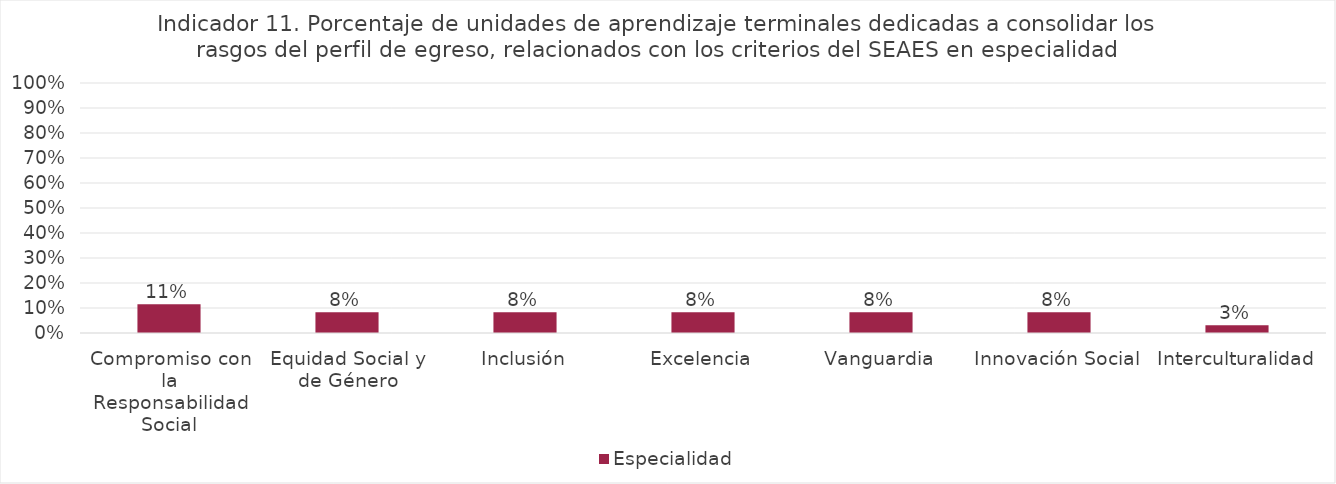
| Category | Especialidad |
|---|---|
| Compromiso con la Responsabilidad Social | 0.115 |
| Equidad Social y de Género | 0.083 |
| Inclusión | 0.083 |
| Excelencia | 0.083 |
| Vanguardia | 0.083 |
| Innovación Social | 0.083 |
| Interculturalidad | 0.031 |